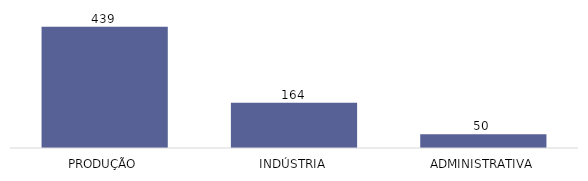
| Category | Total |
|---|---|
| PRODUÇÃO | 439 |
| INDÚSTRIA | 164 |
| ADMINISTRATIVA | 50 |